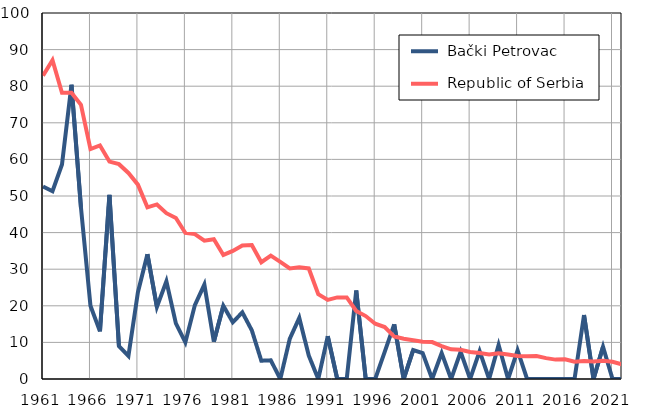
| Category |  Bački Petrovac |  Republic of Serbia |
|---|---|---|
| 1961.0 | 52.6 | 82.9 |
| 1962.0 | 51.3 | 87.1 |
| 1963.0 | 58.6 | 78.2 |
| 1964.0 | 80.4 | 78.2 |
| 1965.0 | 46.8 | 74.9 |
| 1966.0 | 20 | 62.8 |
| 1967.0 | 13 | 63.8 |
| 1968.0 | 50.3 | 59.4 |
| 1969.0 | 9 | 58.7 |
| 1970.0 | 6.3 | 56.3 |
| 1971.0 | 23.7 | 53.1 |
| 1972.0 | 34.1 | 46.9 |
| 1973.0 | 19.7 | 47.7 |
| 1974.0 | 26.7 | 45.3 |
| 1975.0 | 15.2 | 44 |
| 1976.0 | 10 | 39.9 |
| 1977.0 | 20.2 | 39.6 |
| 1978.0 | 25.8 | 37.8 |
| 1979.0 | 10.2 | 38.2 |
| 1980.0 | 20 | 33.9 |
| 1981.0 | 15.5 | 35 |
| 1982.0 | 18.2 | 36.5 |
| 1983.0 | 13.3 | 36.6 |
| 1984.0 | 5 | 31.9 |
| 1985.0 | 5.1 | 33.7 |
| 1986.0 | 0 | 32 |
| 1987.0 | 11 | 30.2 |
| 1988.0 | 16.7 | 30.5 |
| 1989.0 | 6.4 | 30.2 |
| 1990.0 | 0 | 23.2 |
| 1991.0 | 11.7 | 21.6 |
| 1992.0 | 0 | 22.3 |
| 1993.0 | 0 | 22.3 |
| 1994.0 | 24.2 | 18.6 |
| 1995.0 | 0 | 17.2 |
| 1996.0 | 0 | 15.1 |
| 1997.0 | 7.4 | 14.2 |
| 1998.0 | 14.9 | 11.6 |
| 1999.0 | 0 | 11 |
| 2000.0 | 7.9 | 10.6 |
| 2001.0 | 7.1 | 10.2 |
| 2002.0 | 0 | 10.1 |
| 2003.0 | 7.1 | 9 |
| 2004.0 | 0 | 8.1 |
| 2005.0 | 7.4 | 8 |
| 2006.0 | 0 | 7.4 |
| 2007.0 | 7.6 | 7.1 |
| 2008.0 | 0 | 6.7 |
| 2009.0 | 9.3 | 7 |
| 2010.0 | 0 | 6.7 |
| 2011.0 | 7.8 | 6.3 |
| 2012.0 | 0 | 6.2 |
| 2013.0 | 0 | 6.3 |
| 2014.0 | 0 | 5.7 |
| 2015.0 | 0 | 5.3 |
| 2016.0 | 0 | 5.4 |
| 2017.0 | 0 | 4.7 |
| 2018.0 | 17.5 | 4.9 |
| 2019.0 | 0 | 4.8 |
| 2020.0 | 8.8 | 5 |
| 2021.0 | 0 | 4.7 |
| 2022.0 | 0 | 4 |